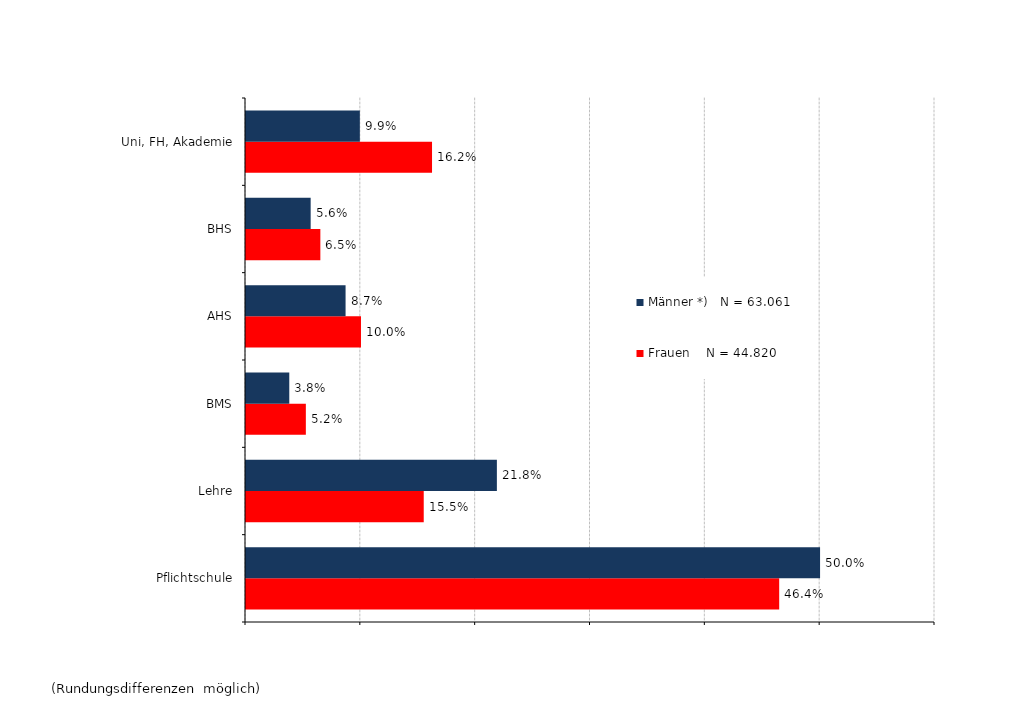
| Category | Frauen    N = 44.820 | Männer *)   N = 63.061 |
|---|---|---|
| Pflichtschule | 0.464 | 0.5 |
| Lehre | 0.155 | 0.218 |
| BMS | 0.052 | 0.038 |
| AHS | 0.1 | 0.087 |
| BHS | 0.065 | 0.056 |
| Uni, FH, Akademie | 0.162 | 0.099 |